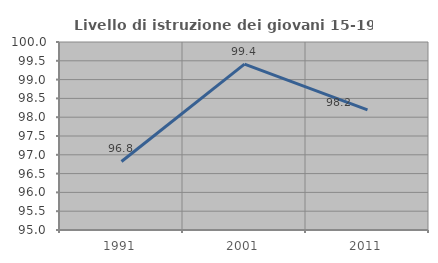
| Category | Livello di istruzione dei giovani 15-19 anni |
|---|---|
| 1991.0 | 96.822 |
| 2001.0 | 99.41 |
| 2011.0 | 98.196 |